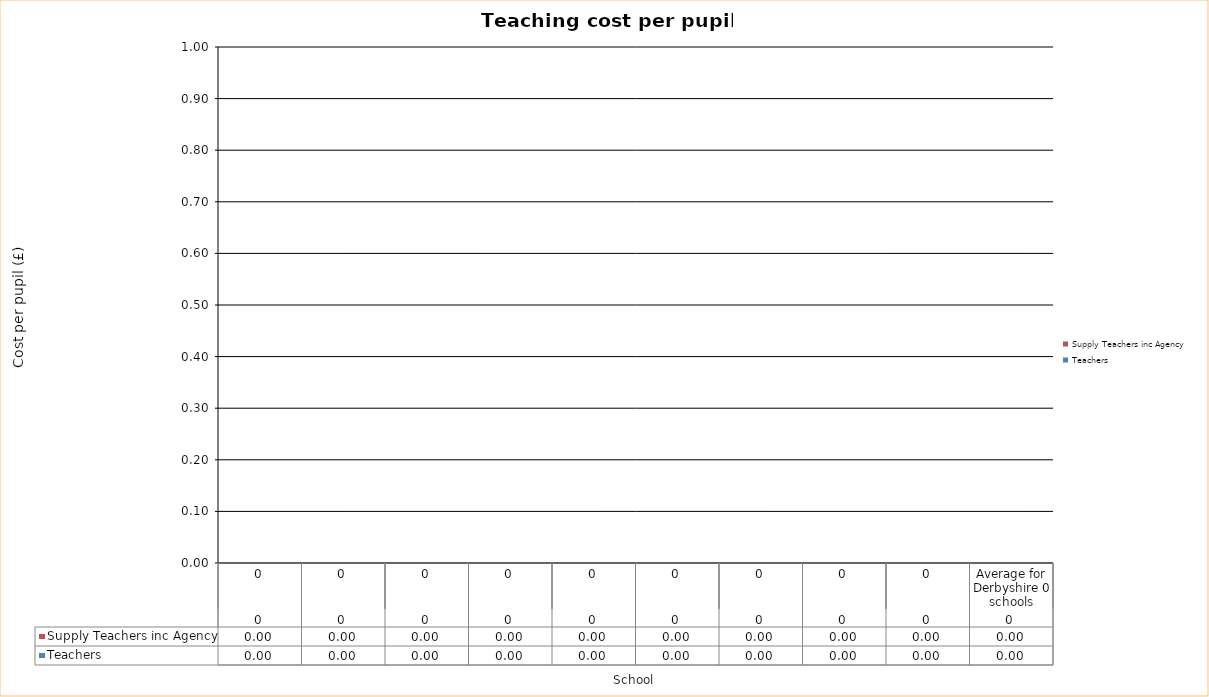
| Category | Teachers | Supply Teachers inc Agency |
|---|---|---|
| 0 | 0 | 0 |
| 1 | 0 | 0 |
| 2 | 0 | 0 |
| 3 | 0 | 0 |
| 4 | 0 | 0 |
| 5 | 0 | 0 |
| 6 | 0 | 0 |
| 7 | 0 | 0 |
| 8 | 0 | 0 |
| 9 | 0 | 0 |